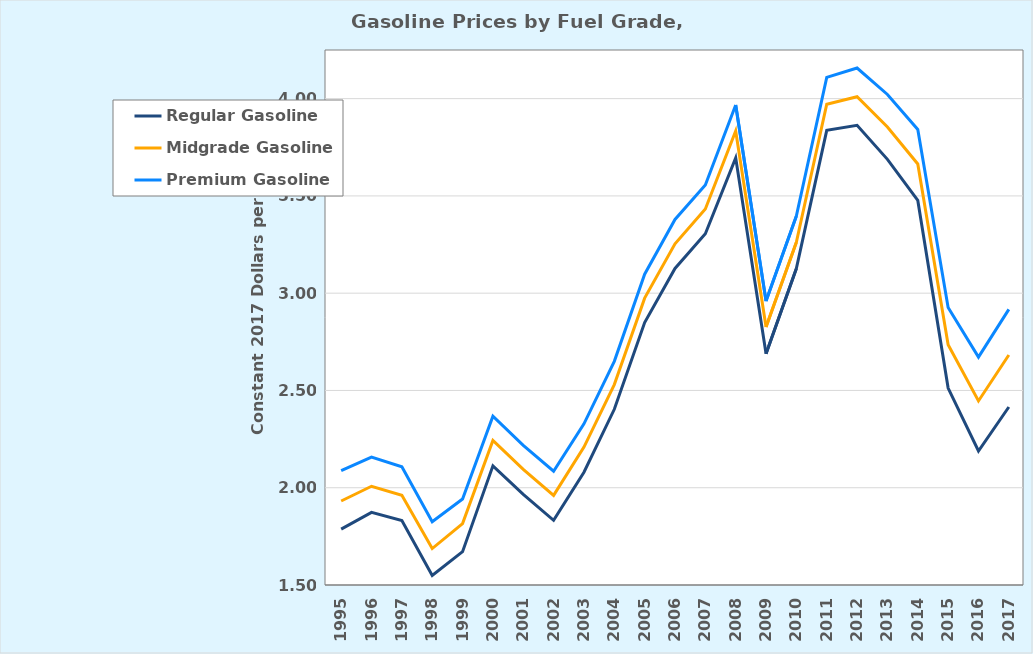
| Category | Regular Gasoline | Midgrade Gasoline | Premium Gasoline |
|---|---|---|---|
| 0 | 1.787 | 1.932 | 2.088 |
| 1900-01-01 | 1.873 | 2.008 | 2.157 |
| 1900-01-02 | 1.831 | 1.961 | 2.108 |
| 1900-01-03 | 1.549 | 1.687 | 1.826 |
| 1900-01-04 | 1.671 | 1.816 | 1.942 |
| 1900-01-05 | 2.112 | 2.243 | 2.367 |
| 1900-01-06 | 1.965 | 2.094 | 2.217 |
| 1900-01-07 | 1.833 | 1.961 | 2.085 |
| 1900-01-08 | 2.08 | 2.209 | 2.329 |
| 1900-01-09 | 2.403 | 2.53 | 2.65 |
| 1900-01-10 | 2.849 | 2.975 | 3.098 |
| 1900-01-11 | 3.127 | 3.254 | 3.379 |
| 1900-01-12 | 3.305 | 3.433 | 3.556 |
| 1900-01-13 | 3.696 | 3.833 | 3.968 |
| 1900-01-14 | 2.688 | 2.827 | 2.959 |
| 1900-01-15 | 3.127 | 3.262 | 3.397 |
| 1900-01-16 | 3.837 | 3.971 | 4.109 |
| 1900-01-17 | 3.863 | 4.01 | 4.157 |
| 1900-01-18 | 3.688 | 3.854 | 4.022 |
| 1900-01-19 | 3.477 | 3.664 | 3.841 |
| 1900-01-20 | 2.512 | 2.735 | 2.927 |
| 1900-01-21 | 2.189 | 2.446 | 2.672 |
| 1900-01-22 | 2.415 | 2.682 | 2.917 |